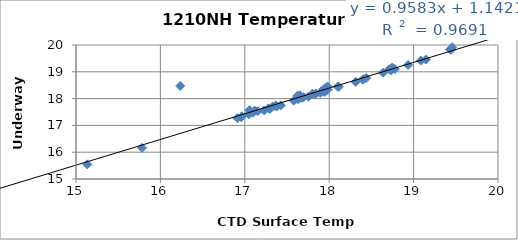
| Category | Series 0 |
|---|---|
| 20.5032 | 20.798 |
| 20.0269 | 20.477 |
| 19.4571 | 19.917 |
| 20.2253 | 20.532 |
| 20.3471 | 20.638 |
| 19.8676 | 20.186 |
| 19.4446 | 19.827 |
| 18.9348 | 19.255 |
| 19.1459 | 19.459 |
| 20.0854 | 20.374 |
| 19.7794 | 20.096 |
| 17.6259 | 17.98 |
| 17.8291 | 18.156 |
| 18.3139 | 18.624 |
| 18.7457 | 19.159 |
| 19.0861 | 19.419 |
| 18.7785 | 19.101 |
| 18.6389 | 18.967 |
| 18.7102 | 19.096 |
| 17.9788 | 18.329 |
| 17.4266 | 17.748 |
| 17.5791 | 17.924 |
| 17.6777 | 18.03 |
| 17.9161 | 18.254 |
| 17.9801 | 18.335 |
| 18.439 | 18.77 |
| 17.942 | 18.303 |
| 18.1002 | 18.446 |
| 18.3973 | 18.71 |
| 16.2346 | 18.473 |
| 18.733 | 19.055 |
| 19.6637 | 20.086 |
| 19.432 | 19.836 |
| 19.7856 | 20.196 |
| 17.6385 | 17.996 |
| 17.3678 | 17.745 |
| 17.1161 | 17.554 |
| 17.8022 | 18.187 |
| 17.2806 | 17.635 |
| 16.9566 | 17.303 |
| 17.9099 | 18.278 |
| 17.8441 | 18.188 |
| 18.4082 | 18.725 |
| 18.1145 | 18.442 |
| 17.6955 | 18.055 |
| 17.7537 | 18.075 |
| 17.3786 | 17.702 |
| 17.2296 | 17.559 |
| 17.0556 | 17.567 |
| 17.9452 | 18.252 |
| 17.2965 | 17.613 |
| 17.1534 | 17.529 |
| 17.3302 | 17.702 |
| 17.8926 | 18.213 |
| 17.6534 | 18.123 |
| 17.9507 | 18.392 |
| 14.8093 | 15.279 |
| 14.3517 | 14.799 |
| 17.9806 | 18.456 |
| 17.0478 | 17.416 |
| 16.9125 | 17.271 |
| 16.9637 | 17.339 |
| 17.0959 | 17.476 |
| 15.7827 | 16.161 |
| 15.1334 | 15.547 |
| 14.0974 | 14.517 |
| 17.6243 | 18.106 |